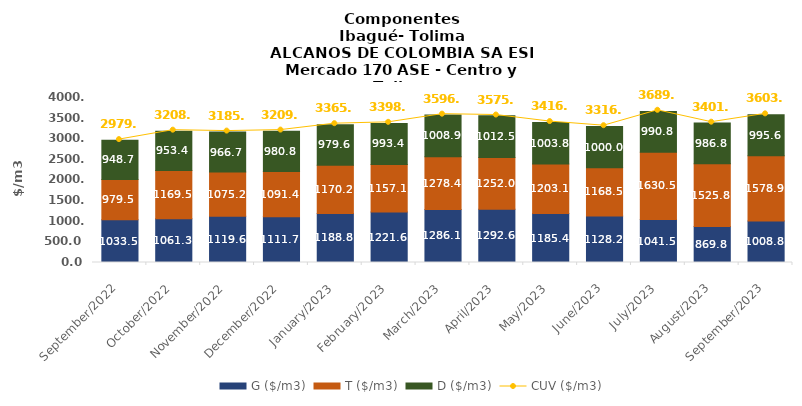
| Category | G ($/m3) | T ($/m3) | D ($/m3) |
|---|---|---|---|
| 2022-09-01 | 1033.47 | 979.51 | 948.67 |
| 2022-10-01 | 1061.27 | 1169.53 | 953.42 |
| 2022-11-01 | 1119.61 | 1075.19 | 966.69 |
| 2022-12-01 | 1111.69 | 1091.36 | 980.8 |
| 2023-01-01 | 1188.81 | 1170.15 | 979.57 |
| 2023-02-01 | 1221.59 | 1157.08 | 993.4 |
| 2023-03-01 | 1286.09 | 1278.38 | 1008.86 |
| 2023-04-01 | 1292.6 | 1251.95 | 1012.48 |
| 2023-05-01 | 1185.42 | 1203.07 | 1003.78 |
| 2023-06-01 | 1128.21 | 1168.47 | 999.96 |
| 2023-07-01 | 1041.54 | 1630.51 | 990.77 |
| 2023-08-01 | 869.82 | 1525.81 | 986.78 |
| 2023-09-01 | 1008.82 | 1578.87 | 995.55 |